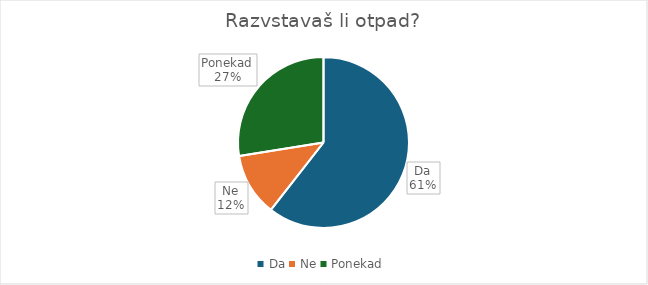
| Category | da |
|---|---|
| Da | 66 |
| Ne | 13 |
| Ponekad | 30 |